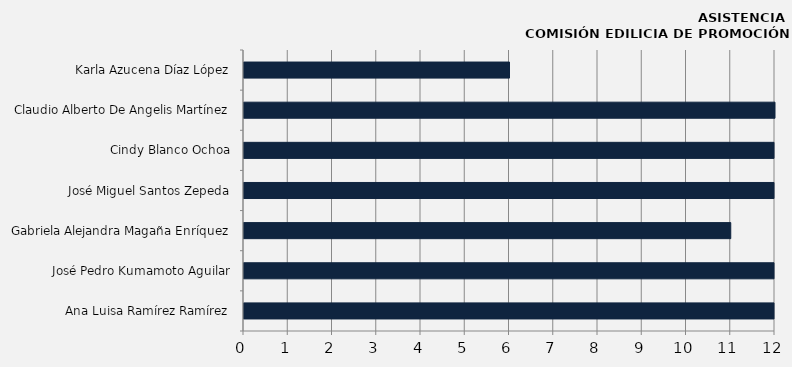
| Category | Ana Luisa Ramírez Ramírez |
|---|---|
| Ana Luisa Ramírez Ramírez | 13 |
| José Pedro Kumamoto Aguilar | 13 |
| Gabriela Alejandra Magaña Enríquez | 11 |
| José Miguel Santos Zepeda | 13 |
| Cindy Blanco Ochoa | 13 |
| Claudio Alberto De Angelis Martínez | 12 |
| Karla Azucena Díaz López | 6 |